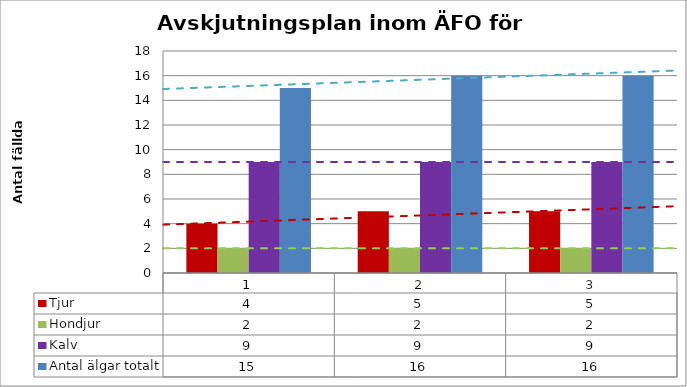
| Category | Tjur | Hondjur | Kalv | Antal älgar totalt |
|---|---|---|---|---|
| 0 | 4 | 2 | 9 | 15 |
| 1 | 5 | 2 | 9 | 16 |
| 2 | 5 | 2 | 9 | 16 |